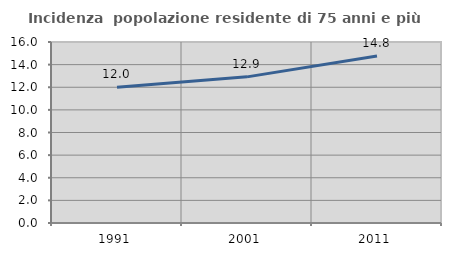
| Category | Incidenza  popolazione residente di 75 anni e più |
|---|---|
| 1991.0 | 12.006 |
| 2001.0 | 12.918 |
| 2011.0 | 14.762 |